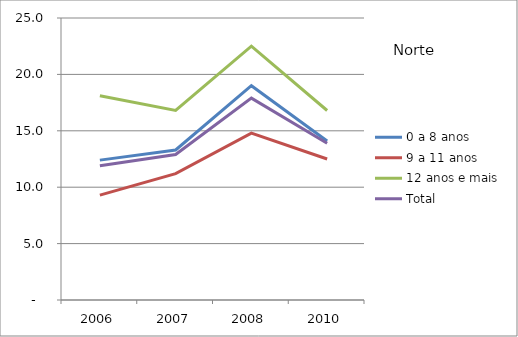
| Category | 0 a 8 anos | 9 a 11 anos | 12 anos e mais | Total |
|---|---|---|---|---|
| 2006.0 | 12.4 | 9.3 | 18.1 | 11.9 |
| 2007.0 | 13.3 | 11.2 | 16.8 | 12.9 |
| 2008.0 | 19 | 14.8 | 22.5 | 17.9 |
| 2010.0 | 14.1 | 12.5 | 16.8 | 13.9 |